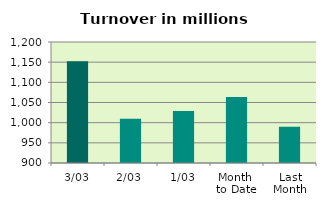
| Category | Series 0 |
|---|---|
| 3/03 | 1152.264 |
| 2/03 | 1010.006 |
| 1/03 | 1028.914 |
| Month 
to Date | 1063.728 |
| Last
Month | 989.924 |